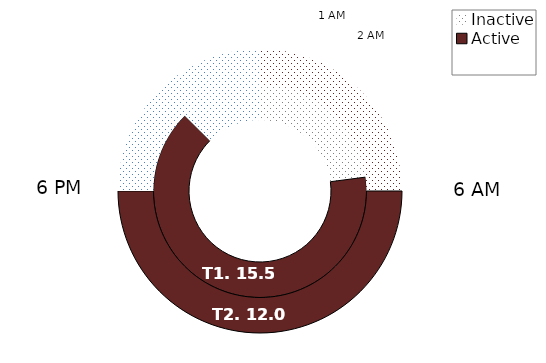
| Category | T1 | T2 | T3 | T4 | T5 | T6 |
|---|---|---|---|---|---|---|
| Inactive | 1900-01-05 12:00:00 | 6 |  |  |  |  |
| Active | 1900-01-15 12:00:00 | 12 |  |  |  |  |
| Inactive | 1900-01-03 | 6 |  |  |  |  |